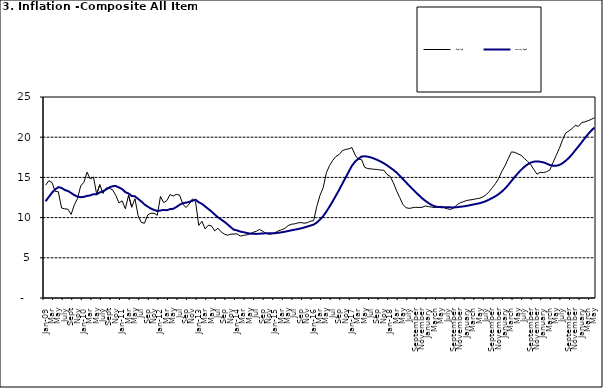
| Category | Year-on Rate | 12-Month Average |
|---|---|---|
| Jan-09 | 14.034 | 12.032 |
| Feb | 14.584 | 12.567 |
| Mar | 14.366 | 13.101 |
| Apr | 13.268 | 13.51 |
| May | 13.212 | 13.787 |
| June | 11.194 | 13.694 |
| July | 11.09 | 13.437 |
| Aug | 11.046 | 13.307 |
| Sept | 10.39 | 13.065 |
| Oct | 11.588 | 12.803 |
| Nov | 12.368 | 12.609 |
| Dec | 13.93 | 12.538 |
| Jan-10 | 14.398 | 12.586 |
| Feb | 15.649 | 12.7 |
| Mar | 14.812 | 12.757 |
| Apr | 15.044 | 12.915 |
| May | 12.915 | 12.893 |
| June | 14.099 | 13.132 |
| July | 13.002 | 13.284 |
| Aug | 13.702 | 13.5 |
| Sept | 13.65 | 13.764 |
| Oct | 13.45 | 13.908 |
| Nov | 12.766 | 13.928 |
| Dec | 11.815 | 13.74 |
| Jan-11 | 12.08 | 13.542 |
| Feb | 11.1 | 13.161 |
| Mar | 12.779 | 13.001 |
| Apr | 11.291 | 12.694 |
| May | 12.352 | 12.648 |
| Jun | 10.23 | 12.321 |
| Jul | 9.397 | 12.009 |
| Aug | 9.301 | 11.635 |
| Sep | 10.339 | 11.363 |
| Oct | 10.544 | 11.13 |
| Nov | 10.54 | 10.952 |
| Dec | 10.283 | 10.826 |
| Jan-12 | 12.626 | 10.886 |
| Feb | 11.866 | 10.955 |
| Mar | 12.111 | 10.914 |
| Apr | 12.866 | 11.054 |
| May | 12.688 | 11.096 |
| Jun | 12.892 | 11.32 |
| Jul | 12.797 | 11.599 |
| Aug | 11.689 | 11.791 |
| Sep | 11.253 | 11.859 |
| Oct | 11.693 | 11.948 |
| Nov | 12.32 | 12.091 |
| Dec | 11.981 | 12.224 |
| Jan-13 | 9.031 | 11.908 |
| Feb | 9.542 | 11.703 |
| Mar | 8.593 | 11.394 |
| Apr | 9.052 | 11.072 |
| May | 8.964 | 10.761 |
| Jun | 8.353 | 10.383 |
| Jul | 8.682 | 10.047 |
| Aug | 8.231 | 9.761 |
| Sep | 7.952 | 9.486 |
| Oct | 7.807 | 9.167 |
| Nov | 7.931 | 8.815 |
| Dec | 7.957 | 8.496 |
| Jan-14 | 7.977 | 8.408 |
| Feb | 7.707 | 8.257 |
| Mar | 7.783 | 8.19 |
| Apr | 7.851 | 8.092 |
| May | 7.965 | 8.012 |
| Jun | 8.167 | 7.998 |
| Jul | 8.281 | 7.968 |
| Aug | 8.534 | 7.996 |
| Sep | 8.317 | 8.027 |
| Oct | 8.06 | 8.047 |
| Nov | 7.927 | 8.046 |
| Dec | 7.978 | 8.047 |
| Jan-15 | 8.157 | 8.063 |
| Feb | 8.359 | 8.117 |
| Mar | 8.494 | 8.176 |
| Apr | 8.655 | 8.243 |
| May | 9.003 | 8.331 |
| Jun | 9.168 | 8.417 |
| Jul | 9.218 | 8.497 |
| Aug | 9.336 | 8.566 |
| Sep | 9.394 | 8.658 |
| Oct | 9.296 | 8.76 |
| Nov | 9.368 | 8.879 |
| Dec | 9.554 | 9.009 |
| Jan-16 | 9.617 | 9.13 |
| Feb | 11.379 | 9.386 |
| Mar | 12.775 | 9.751 |
| Apr | 13.721 | 10.182 |
| May | 15.577 | 10.746 |
| Jun | 16.48 | 11.372 |
| Jul | 17.127 | 12.045 |
| Aug | 17.609 | 12.744 |
| Sep | 17.852 | 13.454 |
| Oct | 18.33 | 14.206 |
| Nov | 18.476 | 14.958 |
| Dec | 18.547 | 15.697 |
| Jan-17 | 18.719 | 16.441 |
| Feb | 17.78 | 16.958 |
| Mar | 17.256 | 17.315 |
| Apr | 17.244 | 17.591 |
| May | 16.251 | 17.628 |
| Jun | 16.098 | 17.578 |
| Jul | 16.053 | 17.475 |
| Aug | 16.012 | 17.331 |
| Sep | 15.979 | 17.17 |
| Oct | 15.905 | 16.968 |
| Nov | 15.901 | 16.76 |
| Dec | 15.372 | 16.502 |
| Jan-18 | 15.127 | 16.215 |
| Feb | 14.33 | 15.93 |
| Mar | 13.337 | 15.599 |
| Apr | 12.482 | 15.196 |
| May | 11.608 | 14.793 |
| June | 11.231 | 14.371 |
| July | 11.142 | 13.95 |
| August | 11.227 | 13.546 |
| September | 11.284 | 13.157 |
| October | 11.259 | 12.777 |
| November | 11.281 | 12.406 |
| December | 11.442 | 12.095 |
| January | 11.374 | 11.801 |
| February | 11.306 | 11.564 |
| March | 11.251 | 11.401 |
| April | 11.372 | 11.314 |
| May | 11.396 | 11.299 |
| June | 11.217 | 11.297 |
| July | 11.084 | 11.291 |
| August | 11.016 | 11.271 |
| September | 11.244 | 11.268 |
| October | 11.607 | 11.298 |
| November | 11.854 | 11.348 |
| December | 11.982 | 11.396 |
| January | 12.132 | 11.462 |
| February | 12.199 | 11.539 |
| March | 12.257 | 11.624 |
| April | 12.341 | 11.706 |
| May | 12.404 | 11.791 |
| June | 12.559 | 11.904 |
| July | 12.821 | 12.049 |
| August | 13.22 | 12.233 |
| September | 13.707 | 12.44 |
| October | 14.233 | 12.664 |
| November | 14.887 | 12.923 |
| December | 15.753 | 13.246 |
| January | 16.466 | 13.616 |
| February | 17.335 | 14.053 |
| March | 18.171 | 14.554 |
| April | 18.117 | 15.039 |
| May | 17.933 | 15.499 |
| June | 17.751 | 15.927 |
| July | 17.377 | 16.298 |
| August | 17.009 | 16.601 |
| September | 16.63 | 16.83 |
| October | 15.994 | 16.958 |
| November | 15.396 | 16.979 |
| December | 15.625 | 16.953 |
| January | 15.601 | 16.869 |
| February | 15.702 | 16.728 |
| March | 15.915 | 16.544 |
| April | 16.819 | 16.449 |
| May | 17.712 | 16.449 |
| June | 18.596 | 16.542 |
| July | 19.643 | 16.755 |
| August | 20.525 | 17.07 |
| September | 20.774 | 17.432 |
| October | 21.087 | 17.865 |
| November | 21.466 | 18.372 |
| December | 21.344 | 18.847 |
| January | 21.816 | 19.362 |
| February | 21.91 | 19.873 |
| March | 22.043 | 20.375 |
| April | 22.222 | 20.816 |
| May | 22.413 | 21.2 |